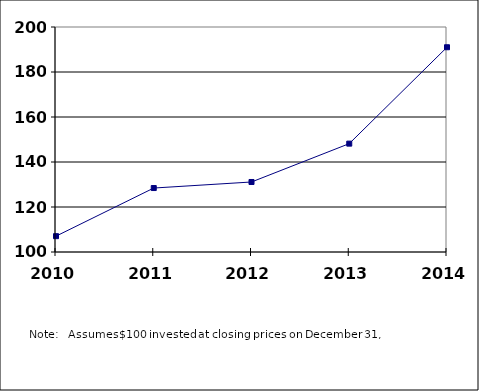
| Category |  100.00  |
|---|---|
| 2010.0 | 107.035 |
| 2011.0 | 128.428 |
| 2012.0 | 131.112 |
| 2013.0 | 148.166 |
| 2014.0 | 191 |